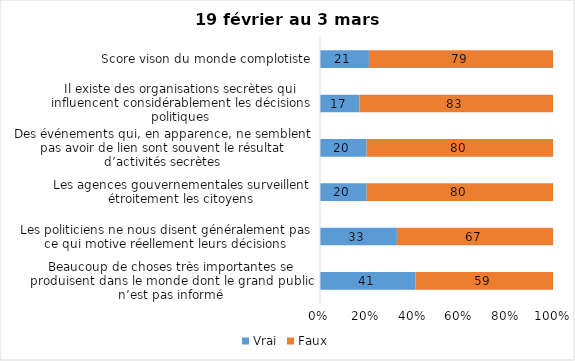
| Category | Vrai | Faux |
|---|---|---|
| Beaucoup de choses très importantes se produisent dans le monde dont le grand public n’est pas informé | 41 | 59 |
| Les politiciens ne nous disent généralement pas ce qui motive réellement leurs décisions | 33 | 67 |
| Les agences gouvernementales surveillent étroitement les citoyens | 20 | 80 |
| Des événements qui, en apparence, ne semblent pas avoir de lien sont souvent le résultat d’activités secrètes | 20 | 80 |
| Il existe des organisations secrètes qui influencent considérablement les décisions politiques | 17 | 83 |
| Score vison du monde complotiste | 21 | 79 |